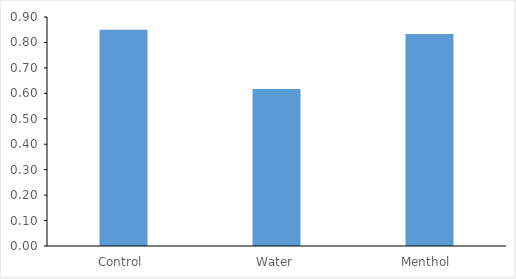
| Category | Series 0 |
|---|---|
| Control  | 0.85 |
| Water | 0.617 |
| Menthol  | 0.833 |